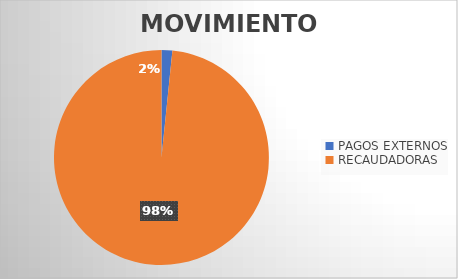
| Category | MOVIMIENTOS |
|---|---|
| PAGOS EXTERNOS | 370 |
| RECAUDADORAS | 22437 |